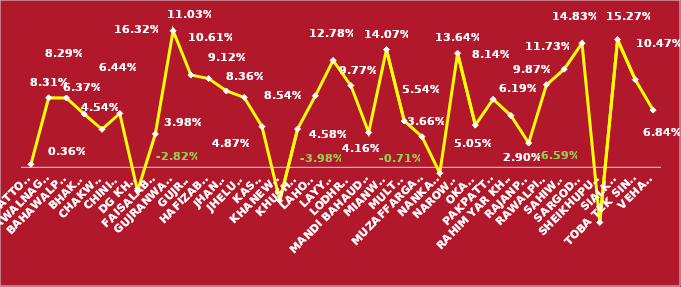
| Category | Series 0 |
|---|---|
| Attock | 0.004 |
| Bahawalnagar | 0.083 |
| Bahawalpur | 0.083 |
| Bhakar | 0.064 |
| Chakwal | 0.045 |
| Chiniot | 0.064 |
| DG Khan | -0.028 |
| Faisalabad | 0.04 |
| Gujranwala | 0.163 |
| Gujrat | 0.11 |
| Hafizabad | 0.106 |
| Jhang | 0.091 |
| Jhelum | 0.084 |
| Kasur | 0.049 |
| Khanewal | -0.04 |
| Khushab | 0.046 |
| Lahore | 0.085 |
| Layyah | 0.128 |
| Lodhran | 0.098 |
| Mandi Bahauddin | 0.042 |
| Mianwali | 0.141 |
| Multan | 0.055 |
| Muzaffargarh | 0.037 |
| Nankana | -0.007 |
| Narowal | 0.136 |
| Okara | 0.05 |
| Pakpattan | 0.081 |
| Rahim Yar Khan | 0.062 |
| Rajanpur | 0.029 |
| Rawalpindi | 0.099 |
| Sahiwal | 0.117 |
| Sargodha | 0.148 |
| Sheikhupura | -0.066 |
| Sialkot | 0.153 |
| Toba Tek Singh | 0.105 |
| Vehari | 0.068 |